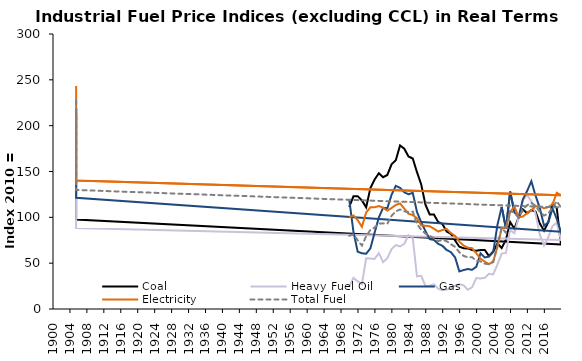
| Category | Coal | Heavy Fuel Oil | Gas | Electricity | Total Fuel |
|---|---|---|---|---|---|
| 1970-01-01 | 111.516 | 24.5 | 119.719 | 99.851 | 79.811 |
| 1971-01-01 | 122.971 | 33.936 | 84.229 | 102.041 | 81.375 |
| 1972-01-01 | 123.096 | 30.142 | 62.531 | 96.971 | 74.948 |
| 1973-01-01 | 118.387 | 27.095 | 60.768 | 89.67 | 69.19 |
| 1974-01-01 | 110.844 | 55.242 | 60.297 | 105.287 | 79.297 |
| 1975-01-01 | 131.864 | 55.18 | 66.123 | 110.923 | 86.286 |
| 1976-01-01 | 141.234 | 54.681 | 83.321 | 110.962 | 88.887 |
| 1977-01-01 | 148.103 | 60.917 | 99.926 | 112.312 | 93.299 |
| 1978-01-01 | 143.774 | 51.086 | 110.356 | 110.517 | 93.429 |
| 1979-01-01 | 146.254 | 55.453 | 110.001 | 107.329 | 93.032 |
| 1980-01-01 | 157.849 | 65.408 | 124.568 | 110.185 | 101.689 |
| 1981-01-01 | 162.258 | 69.706 | 134.321 | 113.51 | 106.484 |
| 1982-01-01 | 178.387 | 68.18 | 132.193 | 115.131 | 108.575 |
| 1983-01-01 | 174.888 | 71.134 | 127.398 | 109.509 | 106.567 |
| 1984-01-01 | 166.415 | 80.397 | 125.12 | 103.91 | 105.735 |
| 1985-01-01 | 164.124 | 77.368 | 126.756 | 102.468 | 106.221 |
| 1986-01-01 | 149.243 | 35.619 | 105.82 | 99.06 | 92.691 |
| 1987-01-01 | 135.814 | 36.161 | 94.58 | 91.267 | 86.415 |
| 1988-01-01 | 113.892 | 25.197 | 84.992 | 90.822 | 82.267 |
| 1989-01-01 | 103.2 | 25.443 | 76.182 | 90.257 | 79.623 |
| 1990-01-01 | 103.122 | 26.893 | 75.343 | 87.535 | 77.448 |
| 1991-01-01 | 94.955 | 22.083 | 71.105 | 84.538 | 73.921 |
| 1992-01-01 | 92.794 | 20.495 | 68.987 | 86.104 | 75.396 |
| 1993-01-01 | 84.456 | 21.179 | 64.387 | 87.456 | 74.023 |
| 1994-01-01 | 82.054 | 22.535 | 62.029 | 82.88 | 70.633 |
| 1995-01-01 | 74.729 | 25.548 | 56.253 | 79.713 | 67.799 |
| 1996-01-01 | 67.895 | 26.95 | 41.055 | 73.51 | 61.932 |
| 1997-01-01 | 66.204 | 25.742 | 42.454 | 69.213 | 57.936 |
| 1998-01-01 | 66.075 | 20.929 | 43.593 | 66.881 | 56.396 |
| 1999-01-01 | 64.204 | 23.636 | 42.771 | 66.372 | 56.542 |
| 2000-01-01 | 63.545 | 33.814 | 45.997 | 60.812 | 52.618 |
| 2001-01-01 | 64.253 | 33.277 | 60.734 | 54.844 | 51.991 |
| 2002-01-01 | 64.432 | 34.105 | 56.187 | 51.748 | 49.489 |
| 2003-01-01 | 57.77 | 38.493 | 57.275 | 48.95 | 48.768 |
| 2004-01-01 | 62.677 | 37.765 | 62.148 | 52.005 | 51.185 |
| 2005-01-01 | 71.502 | 48.738 | 91.778 | 67.672 | 69.803 |
| 2006-01-01 | 66.582 | 60.475 | 111.38 | 88.447 | 88.628 |
| 2007-01-01 | 75.614 | 61.21 | 87.794 | 88.746 | 83.194 |
| 2008-01-01 | 94.878 | 86.259 | 128.057 | 105.691 | 106.745 |
| 2009-01-01 | 87.59 | 82.537 | 105.478 | 111.821 | 105.138 |
| 2010-01-01 | 100 | 100 | 100 | 100 | 100 |
| 2011-01-01 | 108.665 | 118.701 | 119.68 | 100.916 | 108.478 |
| 2012-01-01 | 104.544 | 124.166 | 128.657 | 104.487 | 113.19 |
| 2013-01-01 | 107.818 | 117.739 | 139.453 | 107.78 | 115.874 |
| 2014-01-01 | 106.302 | 103.604 | 123.618 | 112.288 | 112.575 |
| 2015-01-01 | 93.291 | 81.036 | 110.088 | 111.803 | 105.963 |
| 2016-01-01 | 85.449 | 69.215 | 90.75 | 109.875 | 101.849 |
| 2017-01-01 | 94.643 | 78.182 | 94.63 | 111.176 | 104.156 |
| 2018-01-01 | 114.197 | 90.535 | 109.697 | 114.297 | 110.673 |
| 2019-01-01 | 110.246 | 94.069 | 98.183 | 126.762 | 117.545 |
| 2020-01-01 | 70.293 | 75.37 | 84.165 | 124.172 | 110.773 |
| 1905-07-13 | 97.685 | 88.358 | 121.292 | 140.105 | 129.855 |
| 1905-07-14 | 182.165 | 144.613 | 201.895 | 191.513 | 187.225 |
| 1905-07-15 | 214.762 | 167.37 | 219.332 | 243.229 | 229.874 |